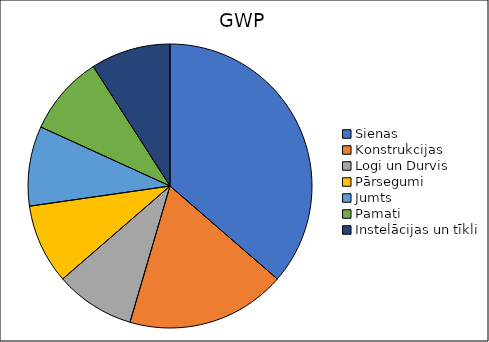
| Category | Sienas  |
|---|---|
| Sienas  | 2 |
| Konstrukcijas | 1 |
| Logi un Durvis | 0.5 |
| Pārsegumi | 0.5 |
| Jumts | 0.5 |
| Pamati | 0.5 |
| Instelācijas un tīkli | 0.5 |